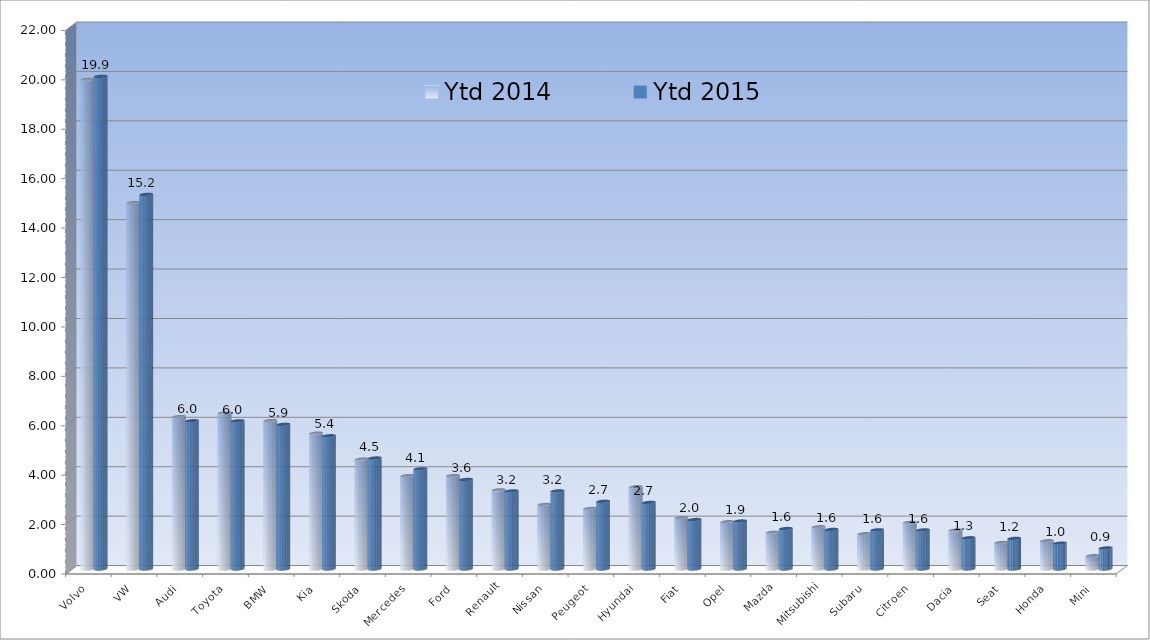
| Category | Ytd 2014 | Ytd 2015 |
|---|---|---|
| Volvo | 19.822 | 19.94 |
| VW | 14.832 | 15.162 |
| Audi | 6.17 | 6 |
| Toyota | 6.32 | 5.997 |
| BMW | 6.006 | 5.857 |
| Kia | 5.497 | 5.393 |
| Skoda | 4.446 | 4.491 |
| Mercedes | 3.778 | 4.054 |
| Ford | 3.78 | 3.625 |
| Renault | 3.203 | 3.162 |
| Nissan | 2.612 | 3.16 |
| Peugeot | 2.45 | 2.74 |
| Hyundai | 3.327 | 2.694 |
| Fiat | 2.079 | 2.001 |
| Opel | 1.913 | 1.941 |
| Mazda | 1.487 | 1.637 |
| Mitsubishi | 1.71 | 1.601 |
| Subaru | 1.427 | 1.585 |
| Citroen | 1.888 | 1.582 |
| Dacia | 1.575 | 1.264 |
| Seat | 1.071 | 1.239 |
| Honda | 1.143 | 1.047 |
| Mini | 0.537 | 0.852 |